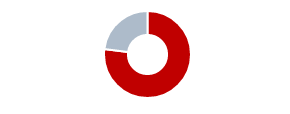
| Category | Series 0 |
|---|---|
| 0 | 0.77 |
| 1 | 0.23 |